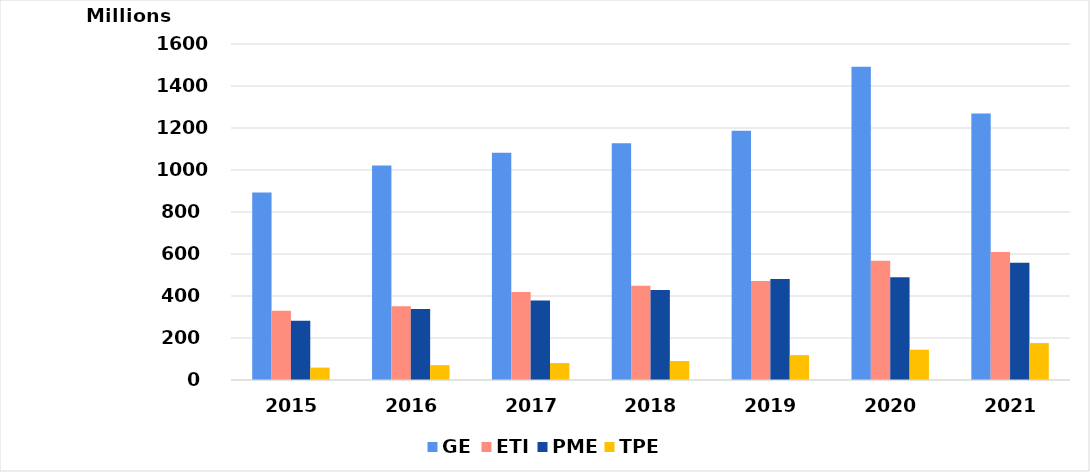
| Category | GE | ETI | PME | TPE |
|---|---|---|---|---|
| 2015.0 | 892524042 | 329675885 | 281614505 | 59044108 |
| 2016.0 | 1021968225 | 351140768 | 338654554 | 70694250 |
| 2017.0 | 1081925573 | 419228573 | 379130208 | 80540887 |
| 2018.0 | 1127119891 | 448364221 | 429052570 | 90291770 |
| 2019.0 | 1186797140 | 470935067 | 481476519 | 118405146 |
| 2020.0 | 1491175484 | 567909512 | 489122601 | 144331006 |
| 2021.0 | 1268712625 | 609269388 | 558822192 | 175859750 |